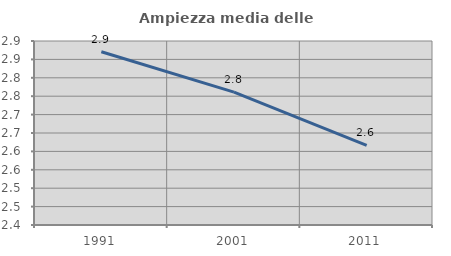
| Category | Ampiezza media delle famiglie |
|---|---|
| 1991.0 | 2.871 |
| 2001.0 | 2.761 |
| 2011.0 | 2.616 |